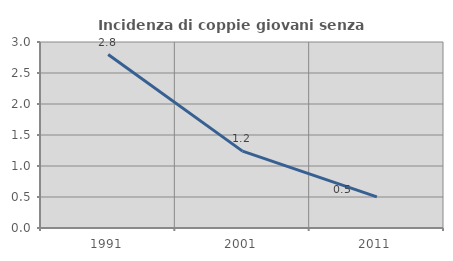
| Category | Incidenza di coppie giovani senza figli |
|---|---|
| 1991.0 | 2.797 |
| 2001.0 | 1.24 |
| 2011.0 | 0.501 |